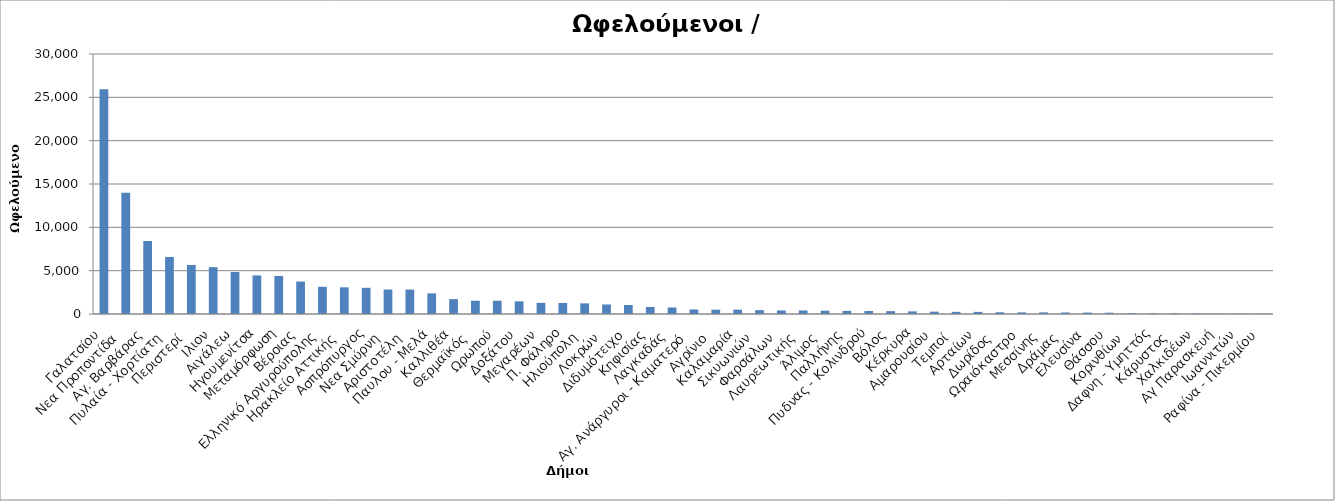
| Category | Ωφελούμενοι  |
|---|---|
| Γαλατσίου | 25943 |
| Νεα Προποντίδα  | 14000 |
| Αγ. Βαρβάρας  | 8425 |
| Πυλαία - Χορτίατη  | 6584 |
| Περιστερί  | 5660 |
| Ιλιον | 5406 |
|  Αιγάλεω | 4846 |
| Ηγουμενίτσα | 4450 |
| Μεταμόρφωση | 4392 |
| Βέροιας | 3743 |
| Ελληνικό Αργυρούπολης | 3140 |
| Ηρακλείο Αττικής  | 3079 |
| Ασπρόπυργος | 3020 |
| Νεα Σμύρνη  | 2822 |
| Αριστοτέλη  | 2815 |
| Παυλου - Μελά  | 2380 |
| Καλλιθέα | 1718 |
| Θερμαϊκός  | 1528 |
| Ωρωπού | 1527 |
| Δοξάτου | 1458 |
| Μεγαρέων | 1285 |
| Π. Φάληρο | 1269 |
| Ηλιούπολη  | 1228 |
| Λοκρών  | 1100 |
| Διδυμότειχο | 1040 |
| Κηφισίας | 812 |
| Λαγκαδάς  | 750 |
| Αγ. Ανάργυροι - Καματερό  | 518 |
| Αγρίνιο  | 500 |
| Καλαμαρία  | 499 |
| Σικυωνιών  | 445 |
| Φαρσάλων  | 411 |
| Λαυρεωτικής  | 410 |
| Άλιμος  | 380 |
| Παλλήνης | 358 |
| Πυδνας - Κολινδρού | 345 |
| Βόλος | 332 |
| Κέρκυρα | 303 |
| Αμαρουσίου | 271 |
| Τεμποί  | 248 |
| Αρταίων | 246 |
| Δωρίδος  | 200 |
| Ωραιόκαστρο | 190 |
| Μεσσίνης | 185 |
| Δράμας  | 176 |
| Ελευσίνα  | 166 |
| Θάσσου | 150 |
| Κορινθίων  | 73 |
| Δαφνη - Υμηττός | 68 |
| Κάρυστος  | 65 |
| Χαλκιδέων | 60 |
| Αγ Παρασκευή  | 30 |
| Ιωαννιτών | 24 |
| Ραφίνα - Πικερμίου | 20 |